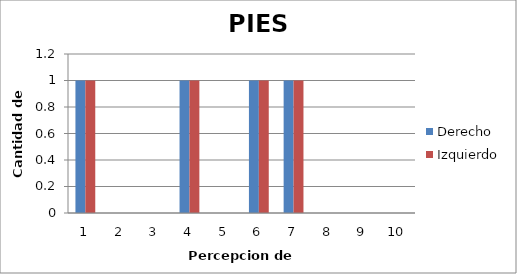
| Category | Derecho  | Izquierdo |
|---|---|---|
| 0 | 1 | 1 |
| 1 | 0 | 0 |
| 2 | 0 | 0 |
| 3 | 1 | 1 |
| 4 | 0 | 0 |
| 5 | 1 | 1 |
| 6 | 1 | 1 |
| 7 | 0 | 0 |
| 8 | 0 | 0 |
| 9 | 0 | 0 |